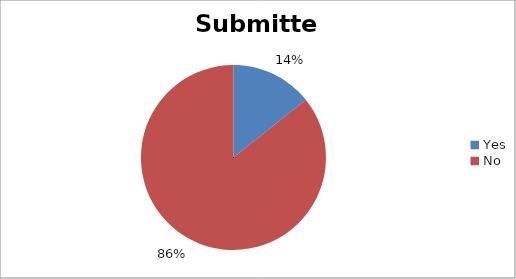
| Category | Submitted |
|---|---|
| Yes | 2 |
| No | 12 |